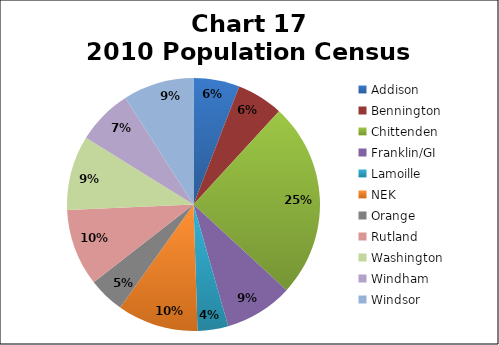
| Category | Series 0 | Series 1 |
|---|---|---|
| Addison  | 36824 | 0.059 |
| Bennington  | 37125 | 0.059 |
| Chittenden | 156540 | 0.25 |
| Franklin/GI | 54722 | 0.087 |
| Lamoille | 24475 | 0.039 |
| NEK | 64763 | 0.103 |
| Orange | 28936 | 0.046 |
| Rutland | 61646 | 0.099 |
| Washington | 59535 | 0.095 |
| Windham | 44513 | 0.071 |
| Windsor | 56666 | 0.091 |